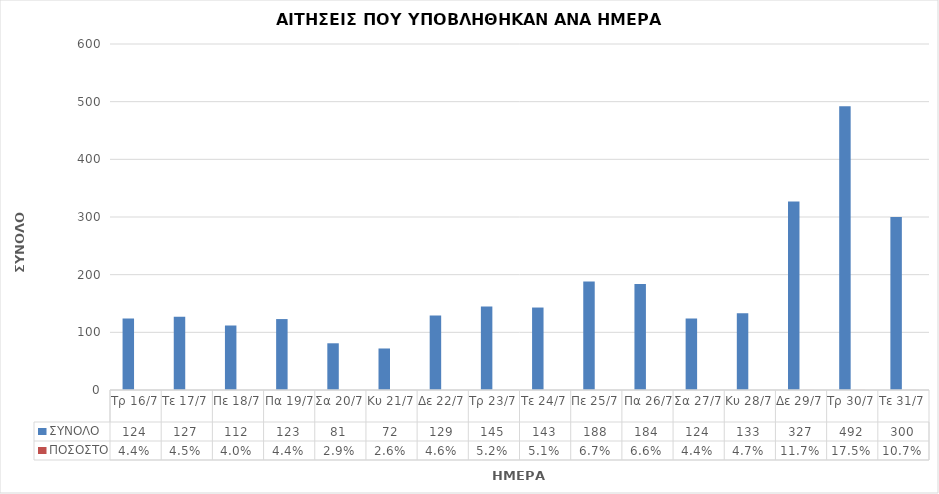
| Category | ΣΥΝΟΛΟ | ΠΟΣΟΣΤΟ |
|---|---|---|
| Τρ 16/7 | 124 | 0.044 |
| Τε 17/7 | 127 | 0.045 |
| Πε 18/7 | 112 | 0.04 |
| Πα 19/7 | 123 | 0.044 |
| Σα 20/7 | 81 | 0.029 |
| Κυ 21/7 | 72 | 0.026 |
| Δε 22/7 | 129 | 0.046 |
| Τρ 23/7 | 145 | 0.052 |
| Τε 24/7 | 143 | 0.051 |
| Πε 25/7 | 188 | 0.067 |
| Πα 26/7 | 184 | 0.066 |
| Σα 27/7 | 124 | 0.044 |
| Κυ 28/7 | 133 | 0.047 |
| Δε 29/7 | 327 | 0.117 |
| Τρ 30/7 | 492 | 0.175 |
| Τε 31/7 | 300 | 0.107 |